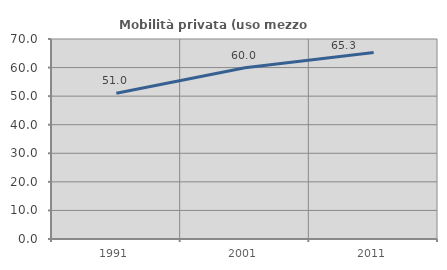
| Category | Mobilità privata (uso mezzo privato) |
|---|---|
| 1991.0 | 51.031 |
| 2001.0 | 59.954 |
| 2011.0 | 65.301 |